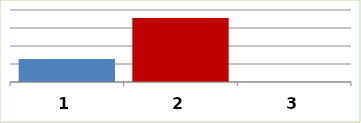
| Category | Series 0 |
|---|---|
| 0 | 63563342 |
| 1 | 178045566 |
| 2 | 0 |